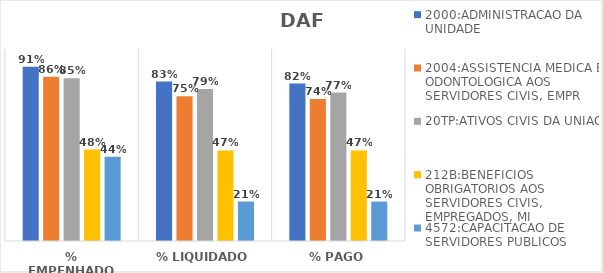
| Category | 2000:ADMINISTRACAO DA UNIDADE | 2004:ASSISTENCIA MEDICA E ODONTOLOGICA AOS SERVIDORES CIVIS, EMPR | 20TP:ATIVOS CIVIS DA UNIAO | 212B:BENEFICIOS OBRIGATORIOS AOS SERVIDORES CIVIS, EMPREGADOS, MI | 4572:CAPACITACAO DE SERVIDORES PUBLICOS FEDERAIS EM PROCESSO DE Q |
|---|---|---|---|---|---|
| % EMPENHADO | 0.908 | 0.856 | 0.848 | 0.476 | 0.438 |
| % LIQUIDADO | 0.831 | 0.755 | 0.792 | 0.472 | 0.205 |
| % PAGO | 0.82 | 0.74 | 0.773 | 0.472 | 0.205 |